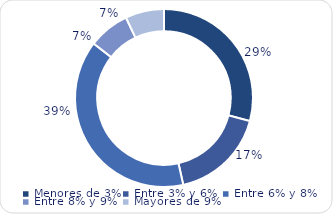
| Category | Series 0 |
|---|---|
| Menores de 3% | 4293.3 |
| Entre 3% y 6% | 2551.6 |
| Entre 6% y 8% | 5731.2 |
| Entre 8% y 9% | 1101.1 |
| Mayores de 9% | 1034 |